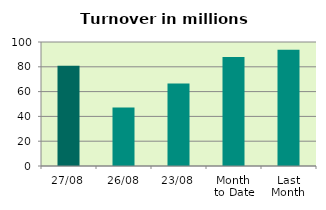
| Category | Series 0 |
|---|---|
| 27/08 | 80.757 |
| 26/08 | 47.163 |
| 23/08 | 66.581 |
| Month 
to Date | 87.931 |
| Last
Month | 93.691 |